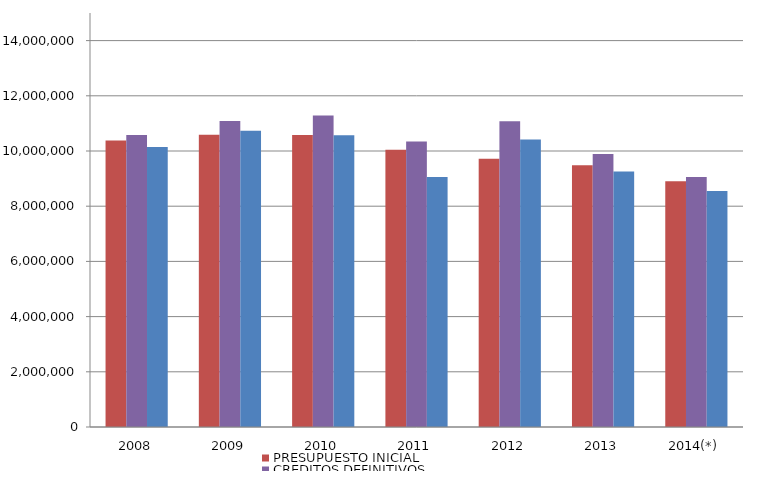
| Category | PRESUPUESTO INICIAL | CREDITOS DEFINITIVOS | OBLIGACIONES RECONOCIDAS NETAS |
|---|---|---|---|
| 2008 | 10384241.1 | 10578579.73 | 10144083.99 |
| 2009 | 10584541.7 | 11087030.69 | 10734120.93 |
| 2010 | 10575537.04 | 11285695.11 | 10569224.36 |
| 2011 | 10045146.21 | 10347634.96 | 9058639.33 |
| 2012 | 9720048.42 | 11079939.46 | 10417057.64 |
| 2013 | 9481615.09 | 9890285.16 | 9256779.75 |
| 2014(*) | 8905196.683 | 9058511.44 | 8553660.33 |